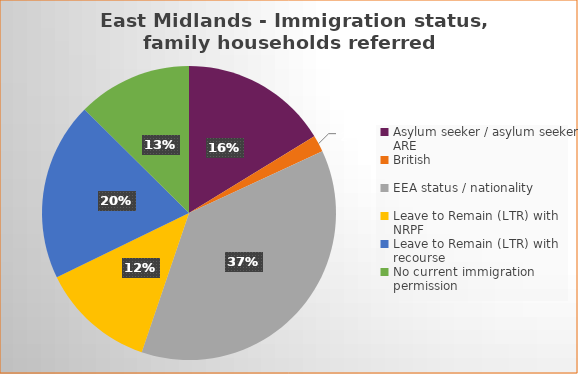
| Category | Number  | Percentage |
|---|---|---|
| Asylum seeker / asylum seeker ARE | 53 | 0.163 |
| British | 6 | 0.018 |
| EEA status / nationality  | 121 | 0.371 |
| Leave to Remain (LTR) with NRPF | 41 | 0.126 |
| Leave to Remain (LTR) with recourse | 64 | 0.196 |
| No current immigration permission | 41 | 0.126 |